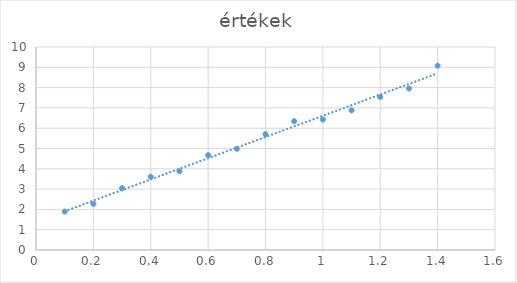
| Category | értékek |
|---|---|
| 0.1 | 1.889 |
| 0.2 | 2.274 |
| 0.3 | 3.049 |
| 0.4 | 3.605 |
| 0.5 | 3.875 |
| 0.6 | 4.673 |
| 0.7 | 4.986 |
| 0.8 | 5.705 |
| 0.9 | 6.345 |
| 1.0 | 6.425 |
| 1.1 | 6.881 |
| 1.2 | 7.537 |
| 1.3 | 7.954 |
| 1.4 | 9.079 |